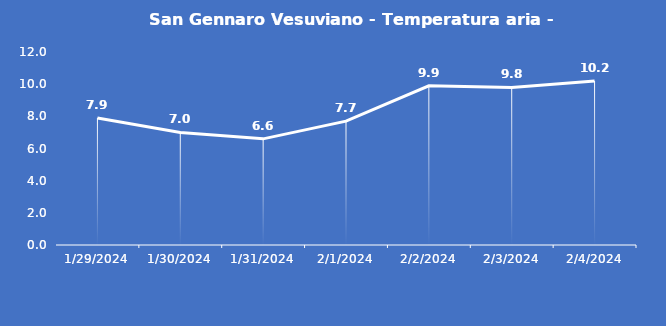
| Category | San Gennaro Vesuviano - Temperatura aria - Grezzo (°C) |
|---|---|
| 1/29/24 | 7.9 |
| 1/30/24 | 7 |
| 1/31/24 | 6.6 |
| 2/1/24 | 7.7 |
| 2/2/24 | 9.9 |
| 2/3/24 | 9.8 |
| 2/4/24 | 10.2 |